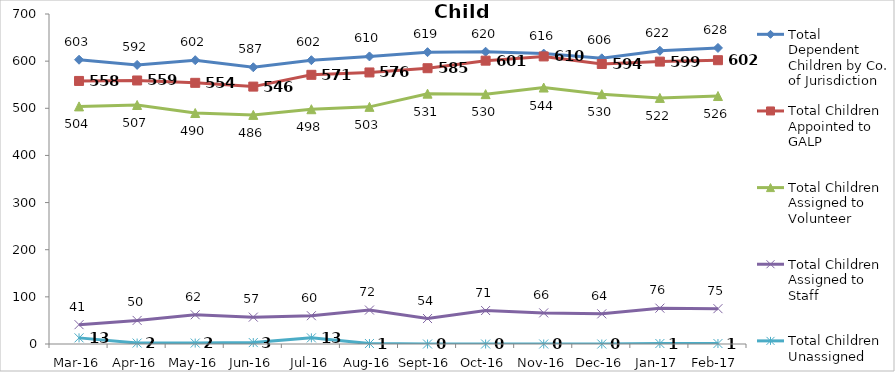
| Category | Total Dependent Children by Co. of Jurisdiction | Total Children Appointed to GALP | Total Children Assigned to Volunteer | Total Children Assigned to Staff | Total Children Unassigned |
|---|---|---|---|---|---|
| Mar-16 | 603 | 558 | 504 | 41 | 13 |
| Apr-16 | 592 | 559 | 507 | 50 | 2 |
| May-16 | 602 | 554 | 490 | 62 | 2 |
| Jun-16 | 587 | 546 | 486 | 57 | 3 |
| Jul-16 | 602 | 571 | 498 | 60 | 13 |
| Aug-16 | 610 | 576 | 503 | 72 | 1 |
| Sep-16 | 619 | 585 | 531 | 54 | 0 |
| Oct-16 | 620 | 601 | 530 | 71 | 0 |
| Nov-16 | 616 | 610 | 544 | 66 | 0 |
| Dec-16 | 606 | 594 | 530 | 64 | 0 |
| Jan-17 | 622 | 599 | 522 | 76 | 1 |
| Feb-17 | 628 | 602 | 526 | 75 | 1 |